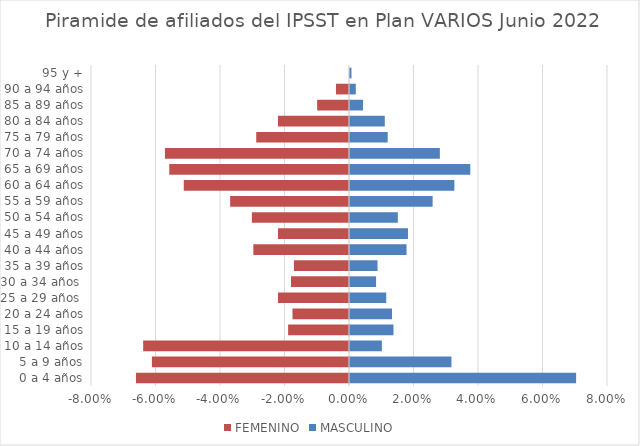
| Category | FEMENINO | MASCULINO |
|---|---|---|
| 0 a 4 años | -0.066 | 0.07 |
| 5 a 9 años | -0.061 | 0.031 |
| 10 a 14 años | -0.064 | 0.01 |
| 15 a 19 años | -0.019 | 0.013 |
| 20 a 24 años | -0.018 | 0.013 |
| 25 a 29 años  | -0.022 | 0.011 |
| 30 a 34 años  | -0.018 | 0.008 |
| 35 a 39 años | -0.017 | 0.009 |
| 40 a 44 años | -0.03 | 0.018 |
| 45 a 49 años | -0.022 | 0.018 |
| 50 a 54 años | -0.03 | 0.015 |
| 55 a 59 años | -0.037 | 0.026 |
| 60 a 64 años | -0.051 | 0.032 |
| 65 a 69 años | -0.056 | 0.037 |
| 70 a 74 años | -0.057 | 0.028 |
| 75 a 79 años | -0.029 | 0.012 |
| 80 a 84 años | -0.022 | 0.011 |
| 85 a 89 años | -0.01 | 0.004 |
| 90 a 94 años | -0.004 | 0.002 |
| 95 y + | 0 | 0 |